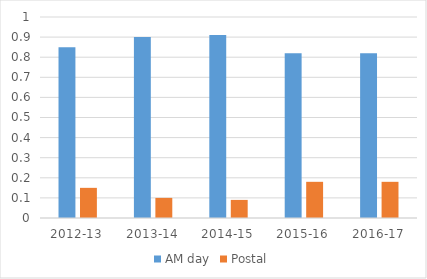
| Category | AM day | Postal |
|---|---|---|
| 2012-13 | 0.85 | 0.15 |
| 2013-14 | 0.9 | 0.1 |
| 2014-15 | 0.91 | 0.09 |
| 2015-16 | 0.82 | 0.18 |
| 2016-17 | 0.82 | 0.18 |